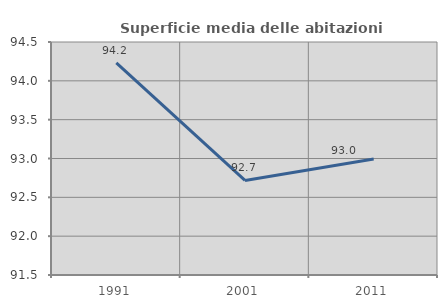
| Category | Superficie media delle abitazioni occupate |
|---|---|
| 1991.0 | 94.232 |
| 2001.0 | 92.717 |
| 2011.0 | 92.995 |